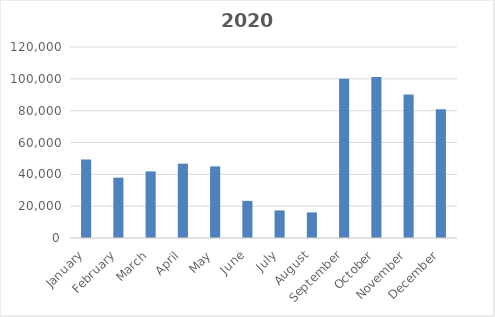
| Category | Series 0 |
|---|---|
| January | 49313 |
| February | 37908 |
| March | 41819 |
| April | 46688 |
| May | 44995 |
| June | 23340 |
| July | 17321 |
| August | 16096 |
| September | 99998 |
| October | 101138 |
| November | 90190 |
| December | 80835 |